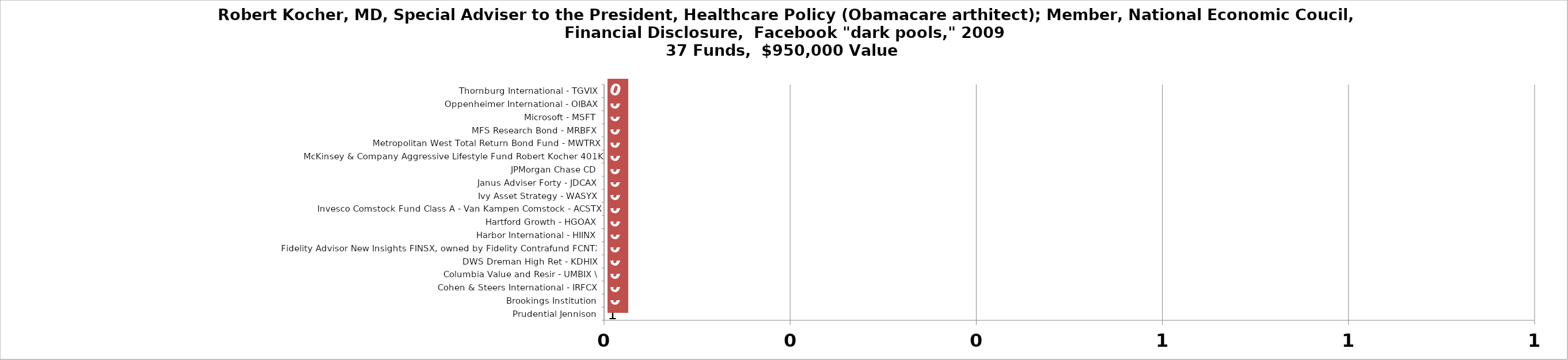
| Category | Series 0 |
|---|---|
| Prudential Jennison | 0 |
| Brookings Institution | 0 |
| Cohen & Steers International - IRFCX | 0 |
| Columbia Value and Resir - UMBIX \ | 0 |
| DWS Dreman High Ret - KDHIX | 0 |
| Fidelity Advisor New Insights FINSX, owned by Fidelity Contrafund FCNTX  | 0 |
| Harbor International - HIINX | 0 |
| Hartford Growth - HGOAX | 0 |
| Invesco Comstock Fund Class A - Van Kampen Comstock - ACSTX | 0 |
| Ivy Asset Strategy - WASYX | 0 |
| Janus Adviser Forty - JDCAX | 0 |
| JPMorgan Chase CD | 0 |
| McKinsey & Company Aggressive Lifestyle Fund Robert Kocher 401K | 0 |
| Metropolitan West Total Return Bond Fund - MWTRX | 0 |
| MFS Research Bond - MRBFX | 0 |
| Microsoft - MSFT | 0 |
| Oppenheimer International - OIBAX | 0 |
| Thornburg International - TGVIX | 0 |